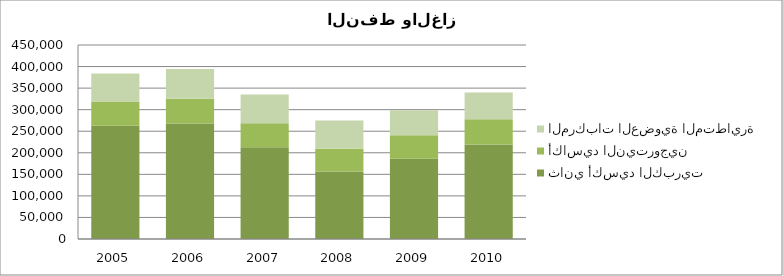
| Category | ثاني أكسيد الكبريت  | أكاسيد النيتروجين | المركبات العضوية المتطايرة  |
|---|---|---|---|
| 2005.0 | 262539 | 56225 | 64915 |
| 2006.0 | 267739 | 57332 | 69339 |
| 2007.0 | 212722 | 55881 | 66698 |
| 2008.0 | 156674 | 52755 | 65475 |
| 2009.0 | 185869.69 | 54781.82 | 57999.01 |
| 2010.0 | 219022 | 58901 | 62170 |